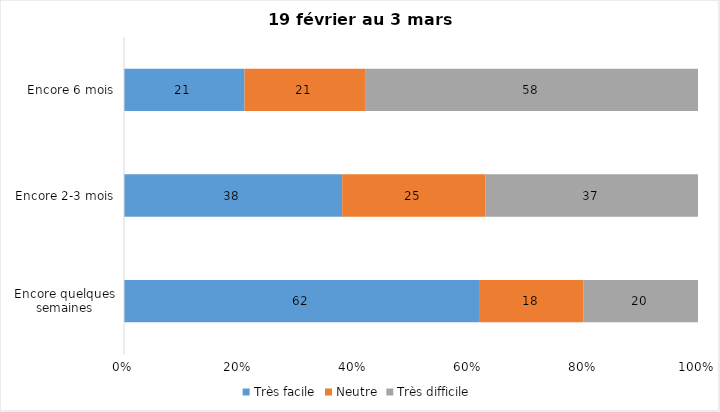
| Category | Très facile | Neutre | Très difficile |
|---|---|---|---|
| Encore quelques semaines | 62 | 18 | 20 |
| Encore 2-3 mois | 38 | 25 | 37 |
| Encore 6 mois | 21 | 21 | 58 |